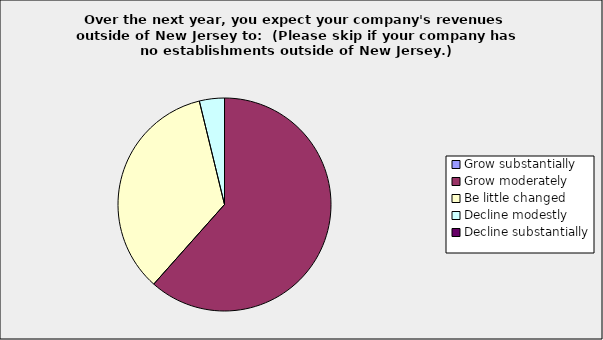
| Category | Series 0 |
|---|---|
| Grow substantially | 0 |
| Grow moderately | 0.615 |
| Be little changed | 0.346 |
| Decline modestly | 0.038 |
| Decline substantially | 0 |